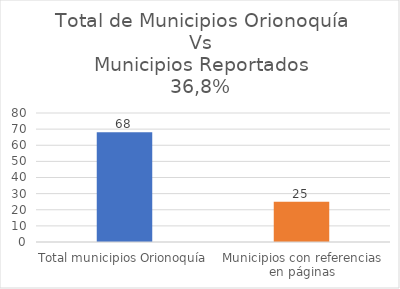
| Category | Series 0 |
|---|---|
| Total municipios Orionoquía | 68 |
| Municipios con referencias en páginas | 25 |